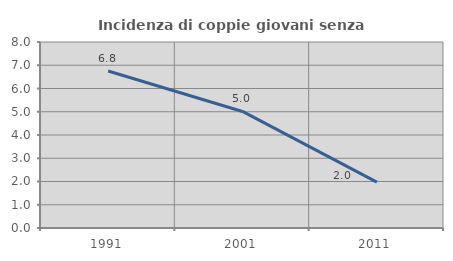
| Category | Incidenza di coppie giovani senza figli |
|---|---|
| 1991.0 | 6.753 |
| 2001.0 | 5.013 |
| 2011.0 | 1.972 |